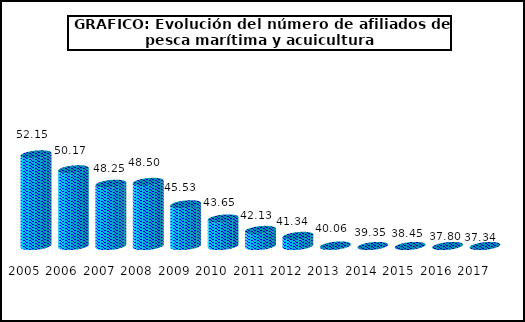
| Category | Series1 |
|---|---|
| 2005.0 | 52.15 |
| 2006.0 | 50.17 |
| 2007.0 | 48.25 |
| 2008.0 | 48.5 |
| 2009.0 | 45.53 |
| 2010.0 | 43.65 |
| 2011.0 | 42.13 |
| 2012.0 | 41.34 |
| 2013.0 | 40.06 |
| 2014.0 | 39.35 |
| 2015.0 | 38.45 |
| 2016.0 | 37.8 |
| 2017.0 | 37.34 |